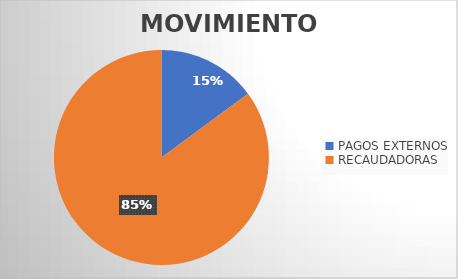
| Category | MOVIMIENTOS |
|---|---|
| PAGOS EXTERNOS | 14700 |
| RECAUDADORAS | 84099 |